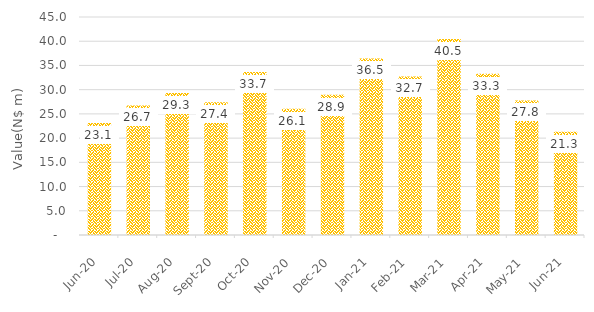
| Category | Value (N$) |
|---|---|
| 2020-06-01 | 23.122 |
| 2020-07-01 | 26.745 |
| 2020-08-01 | 29.337 |
| 2020-09-01 | 27.385 |
| 2020-10-01 | 33.653 |
| 2020-11-01 | 26.081 |
| 2020-12-01 | 28.948 |
| 2021-01-01 | 36.453 |
| 2021-02-01 | 32.725 |
| 2021-03-01 | 40.481 |
| 2021-04-01 | 33.311 |
| 2021-05-01 | 27.777 |
| 2021-06-01 | 21.309 |